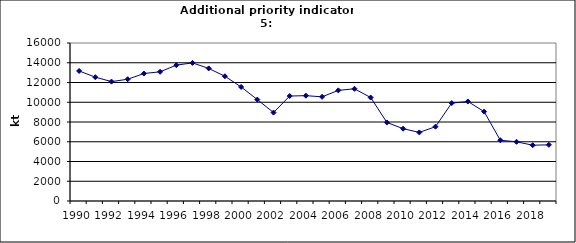
| Category | Production of oxygen steel, kt |
|---|---|
| 1990 | 13169 |
| 1991 | 12540 |
| 1992 | 12091 |
| 1993 | 12330 |
| 1994 | 12909 |
| 1995 | 13083 |
| 1996 | 13759 |
| 1997 | 13986.5 |
| 1998 | 13426 |
| 1999 | 12633.5 |
| 2000 | 11550.8 |
| 2001 | 10270.8 |
| 2002 | 8955.8 |
| 2003 | 10629.6 |
| 2004 | 10667.2 |
| 2005 | 10549.7 |
| 2006 | 11202.6 |
| 2007 | 11361.9 |
| 2008 | 10478 |
| 2009 | 7955 |
| 2010 | 7322.9 |
| 2011 | 6946.2 |
| 2012 | 7525.1 |
| 2013 | 9915.1 |
| 2014 | 10078.6 |
| 2015 | 9050.8 |
| 2016 | 6152.7 |
| 2017 | 5997.3 |
| 2018 | 5651.2 |
| 2019 | 5687.3 |